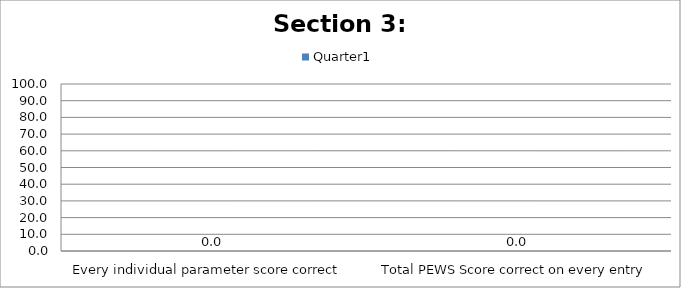
| Category | Quarter1 |
|---|---|
| Every individual parameter score correct  | 0 |
| Total PEWS Score correct on every entry | 0 |